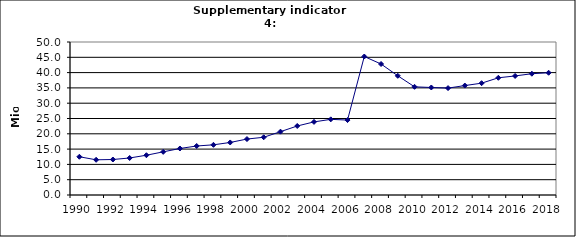
| Category | Domestic air-passengers, Mio |
|---|---|
| 1990 | 12.5 |
| 1991 | 11.5 |
| 1992 | 11.6 |
| 1993 | 12.1 |
| 1994 | 13 |
| 1995 | 14.1 |
| 1996 | 15.2 |
| 1997 | 16.013 |
| 1998 | 16.4 |
| 1999 | 17.17 |
| 2000 | 18.283 |
| 2001 | 18.867 |
| 2002 | 20.696 |
| 2003 | 22.553 |
| 2004 | 23.89 |
| 2005 | 24.719 |
| 2006 | 24.491 |
| 2007 | 45.256 |
| 2008 | 42.812 |
| 2009 | 38.953 |
| 2010 | 35.351 |
| 2011 | 35.132 |
| 2012 | 34.935 |
| 2013 | 35.761 |
| 2014 | 36.543 |
| 2015 | 38.307 |
| 2016 | 38.904 |
| 2017 | 39.637 |
| 2018 | 39.951 |